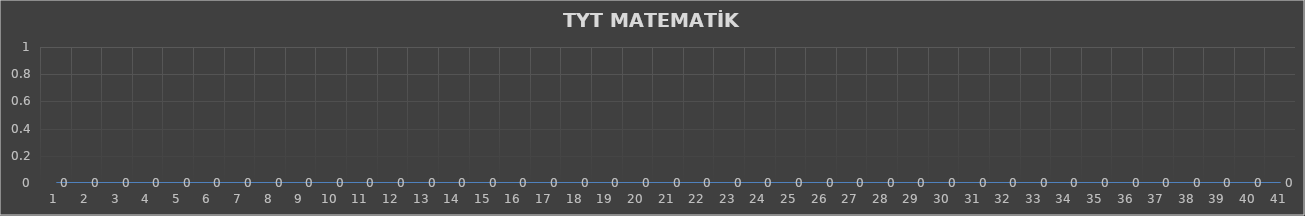
| Category | Series 0 |
|---|---|
| 0 | 0 |
| 1 | 0 |
| 2 | 0 |
| 3 | 0 |
| 4 | 0 |
| 5 | 0 |
| 6 | 0 |
| 7 | 0 |
| 8 | 0 |
| 9 | 0 |
| 10 | 0 |
| 11 | 0 |
| 12 | 0 |
| 13 | 0 |
| 14 | 0 |
| 15 | 0 |
| 16 | 0 |
| 17 | 0 |
| 18 | 0 |
| 19 | 0 |
| 20 | 0 |
| 21 | 0 |
| 22 | 0 |
| 23 | 0 |
| 24 | 0 |
| 25 | 0 |
| 26 | 0 |
| 27 | 0 |
| 28 | 0 |
| 29 | 0 |
| 30 | 0 |
| 31 | 0 |
| 32 | 0 |
| 33 | 0 |
| 34 | 0 |
| 35 | 0 |
| 36 | 0 |
| 37 | 0 |
| 38 | 0 |
| 39 | 0 |
| 40 | 0 |